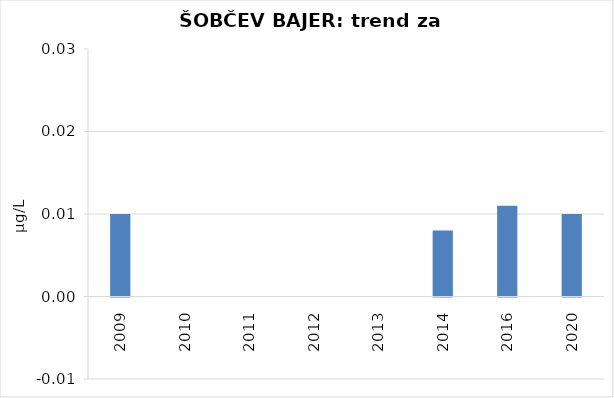
| Category | Vsota |
|---|---|
| 2009 | 0.01 |
| 2010 | 0 |
| 2011 | 0 |
| 2012 | 0 |
| 2013 | 0 |
| 2014 | 0.008 |
| 2016 | 0.011 |
| 2020 | 0.01 |